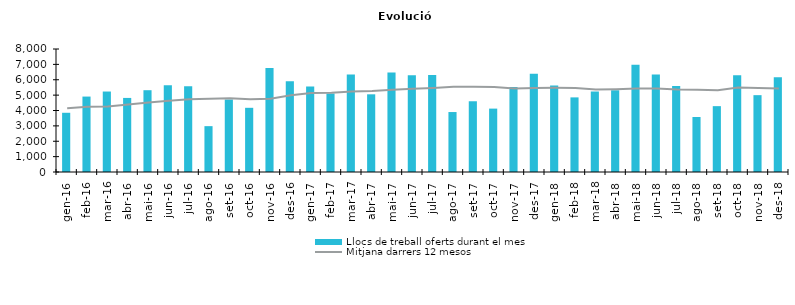
| Category | Llocs de treball oferts durant el mes |
|---|---|
| gen-16 | 3852 |
| feb-16 | 4906 |
| mar-16 | 5234 |
| abr-16 | 4818 |
| mai-16 | 5320 |
| jun-16 | 5650 |
| jul-16 | 5582 |
| ago-16 | 2982 |
| set-16 | 4715 |
| oct-16 | 4175 |
| nov-16 | 6759 |
| des-16 | 5907 |
| gen-17 | 5555 |
| feb-17 | 5107 |
| mar-17 | 6334 |
| abr-17 | 5053 |
| mai-17 | 6468 |
| jun-17 | 6286 |
| jul-17 | 6307 |
| ago-17 | 3900 |
| set-17 | 4601 |
| oct-17 | 4123 |
| nov-17 | 5532 |
| des-17 | 6392 |
| gen-18 | 5622 |
| feb-18 | 4853 |
| mar-18 | 5236 |
| abr-18 | 5316 |
| mai-18 | 6980 |
| jun-18 | 6338 |
| jul-18 | 5588 |
| ago-18 | 3576 |
| set-18 | 4283 |
| oct-18 | 6289 |
| nov-18 | 4998 |
| des-18 | 6157 |